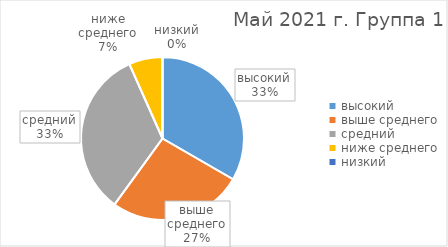
| Category | Series 0 |
|---|---|
| высокий | 5 |
| выше среднего | 4 |
| средний | 5 |
| ниже среднего | 1 |
| низкий | 0 |